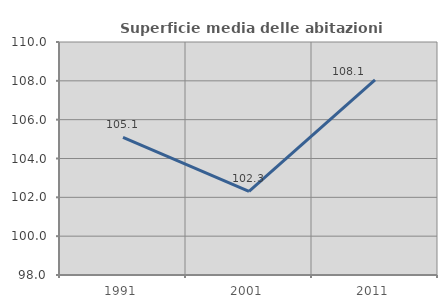
| Category | Superficie media delle abitazioni occupate |
|---|---|
| 1991.0 | 105.085 |
| 2001.0 | 102.301 |
| 2011.0 | 108.053 |